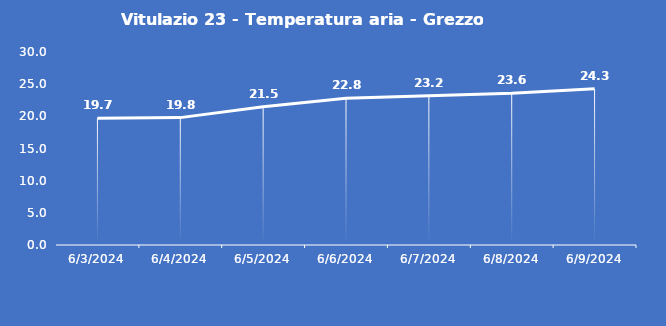
| Category | Vitulazio 23 - Temperatura aria - Grezzo (°C) |
|---|---|
| 6/3/24 | 19.7 |
| 6/4/24 | 19.8 |
| 6/5/24 | 21.5 |
| 6/6/24 | 22.8 |
| 6/7/24 | 23.2 |
| 6/8/24 | 23.6 |
| 6/9/24 | 24.3 |